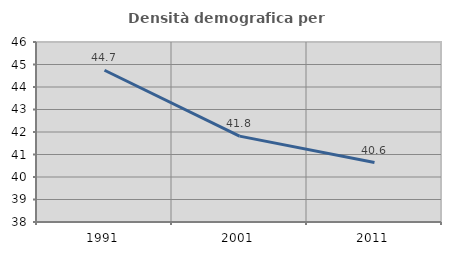
| Category | Densità demografica |
|---|---|
| 1991.0 | 44.744 |
| 2001.0 | 41.816 |
| 2011.0 | 40.644 |